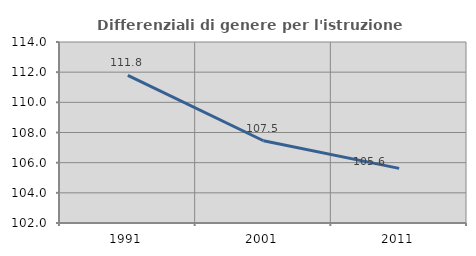
| Category | Differenziali di genere per l'istruzione superiore |
|---|---|
| 1991.0 | 111.79 |
| 2001.0 | 107.452 |
| 2011.0 | 105.621 |